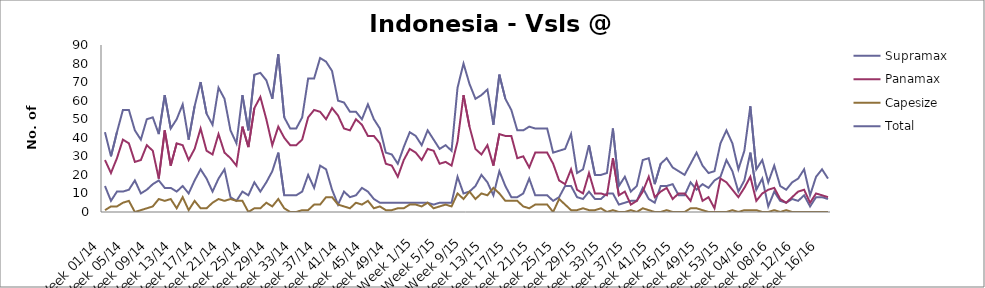
| Category | Supramax | Panamax | Capesize | Total |
|---|---|---|---|---|
| Week 01/14 | 14 | 28 | 1 | 43 |
| Week 02/14 | 6 | 21 | 3 | 30 |
| Week 03/14 | 11 | 29 | 3 | 43 |
| Week 04/14 | 11 | 39 | 5 | 55 |
| Week 05/14 | 12 | 37 | 6 | 55 |
| Week 06/14 | 17 | 27 | 0 | 44 |
| Week 07/14 | 10 | 28 | 1 | 39 |
| Week 08/14 | 12 | 36 | 2 | 50 |
| Week 09/14 | 15 | 33 | 3 | 51 |
| Week 10/14 | 17 | 18 | 7 | 42 |
| Week 11/14 | 13 | 44 | 6 | 63 |
| Week 12/14 | 13 | 25 | 7 | 45 |
| Week 13/14 | 11 | 37 | 2 | 50 |
| Week 14/14 | 14 | 36 | 8 | 58 |
| Week 15/14 | 10 | 28 | 1 | 39 |
| Week 16/14 | 17 | 34 | 6 | 57 |
| Week 17/14 | 23 | 45 | 2 | 70 |
| Week 18/14 | 18 | 33 | 2 | 53 |
| Week 19/14 | 11 | 31 | 5 | 47 |
| Week 20/14 | 18 | 42 | 7 | 67 |
| Week 21/14 | 23 | 32 | 6 | 61 |
| Week 22/14 | 8 | 29 | 7 | 44 |
| Week 23/14 | 6 | 25 | 6 | 37 |
| Week 24/14 | 11 | 46 | 6 | 63 |
| Week 25/14 | 9 | 35 | 0 | 44 |
| Week 26/14 | 16 | 56 | 2 | 74 |
| Week 27/14 | 11 | 62 | 2 | 75 |
| Week 28/14 | 16 | 50 | 5 | 71 |
| Week 29/14 | 22 | 36 | 3 | 61 |
| Week 30/14 | 32 | 46 | 7 | 85 |
| Week 31/14 | 9 | 40 | 2 | 51 |
| Week 32/14 | 9 | 36 | 0 | 45 |
| Week 33/14 | 9 | 36 | 0 | 45 |
| Week 34/14 | 11 | 39 | 1 | 51 |
| Week 35/14 | 20 | 51 | 1 | 72 |
| Week 36/14 | 13 | 55 | 4 | 72 |
| Week 37/14 | 25 | 54 | 4 | 83 |
| Week 38/14 | 23 | 50 | 8 | 81 |
| Week 39/14 | 12 | 56 | 8 | 76 |
| Week 40/14 | 4 | 52 | 4 | 60 |
| Week 41/14 | 11 | 45 | 3 | 59 |
| Week 42/14 | 8 | 44 | 2 | 54 |
| Week 43/14 | 9 | 50 | 5 | 54 |
| Week 44/14 | 13 | 47 | 4 | 50 |
| Week 45/14 | 11 | 41 | 6 | 58 |
| Week 46/14 | 7 | 41 | 2 | 50 |
| Week 47/14 | 5 | 37 | 3 | 45 |
| Week 48/14 | 5 | 26 | 1 | 32 |
| Week 49/14 | 5 | 25 | 1 | 31 |
| Week 50/14 | 5 | 19 | 2 | 26 |
| Week 51/14 | 5 | 28 | 2 | 35 |
| Week 52/14 | 5 | 34 | 4 | 43 |
| Week 1/15 | 5 | 32 | 4 | 41 |
| Week 2/15 | 5 | 28 | 3 | 36 |
| Week 3/15 | 5 | 34 | 5 | 44 |
| Week 4/15 | 4 | 33 | 2 | 39 |
| Week 5/15 | 5 | 26 | 3 | 34 |
| Week 6/15 | 5 | 27 | 4 | 36 |
| Week 7/15 | 5 | 25 | 3 | 33 |
| Week 8/15 | 19 | 38 | 10 | 67 |
| Week 9/15 | 10 | 63 | 7 | 80 |
| Week 10/15 | 11 | 46 | 11 | 69 |
| Week 11/15 | 14 | 34 | 7 | 61 |
| Week 12/15 | 20 | 31 | 10 | 63 |
| Week 13/15 | 16 | 36 | 9 | 66 |
| Week 14/15 | 9 | 25 | 13 | 47 |
| Week 15/15 | 22 | 42 | 10 | 74 |
| Week 16/15 | 14 | 41 | 6 | 61 |
| Week 17/15 | 8 | 41 | 6 | 55 |
| Week 18/15 | 8 | 29 | 6 | 44 |
| Week 19/15 | 10 | 30 | 3 | 44 |
| Week 20/15 | 18 | 24 | 2 | 46 |
| Week 21/15 | 9 | 32 | 4 | 45 |
| Week 22/15 | 9 | 32 | 4 | 45 |
| Week 23/15 | 9 | 32 | 4 | 45 |
| Week 24/15 | 6 | 26 | 0 | 32 |
| Week 25/15 | 8 | 17 | 7 | 33 |
| Week 26/15 | 14 | 15 | 4 | 34 |
| Week 27/15 | 14 | 23 | 1 | 42 |
| Week 28/15 | 8 | 12 | 1 | 21 |
| Week 29/15 | 7 | 10 | 2 | 23 |
| Week 30/15 | 11 | 21 | 1 | 36 |
| Week 31/15 | 7 | 10 | 1 | 20 |
| Week 32/15 | 7 | 10 | 2 | 20 |
| Week 33/15 | 10 | 9 | 0 | 21 |
| Week 34/15 | 10 | 29 | 1 | 45 |
| Week 35/15 | 4 | 9 | 0 | 14 |
| Week 36/15 | 5 | 11 | 0 | 19 |
| Week 37/15 | 6 | 4 | 1 | 11 |
| Week 38/15 | 6 | 6 | 0 | 14 |
| Week 39/15 | 13 | 11 | 2 | 28 |
| Week 40/15 | 7 | 19 | 1 | 29 |
| Week 41/15 | 5 | 8 | 0 | 15 |
| Week 42/15 | 14 | 11 | 0 | 26 |
| Week 43/15 | 14 | 13 | 1 | 29 |
| Week 44/15 | 15 | 7 | 0 | 24 |
| Week 45/15 | 9 | 10 | 0 | 22 |
| Week 46/15 | 9 | 10 | 0 | 20 |
| Week 47/15 | 16 | 6 | 2 | 26 |
| Week 48/15 | 12 | 16 | 2 | 32 |
| Week 49/15 | 15 | 6 | 1 | 25 |
| Week 50/15 | 13 | 8 | 0 | 21 |
| Week 51/15 | 17 | 2 | 0 | 22 |
| Week 52/15 | 19 | 18 | 0 | 37 |
| Week 53/15 | 28 | 16 | 0 | 44 |
| Week 01/16 | 22 | 12 | 1 | 37 |
| Week 02/16 | 11 | 8 | 0 | 23 |
| Week 03/16 | 17 | 13 | 1 | 33 |
| Week 04/16 | 32 | 19 | 1 | 57 |
| Week 05/16 | 12 | 6 | 1 | 23 |
| Week 06/16 | 18 | 10 | 0 | 28 |
| Week 07/16 | 3 | 12 | 0 | 16 |
| Week 08/16 | 11 | 13 | 1 | 25 |
| Week 09/16 | 6 | 7 | 0 | 14 |
| Week 10/16 | 5 | 5 | 1 | 12 |
| Week 11/16 | 7 | 8 | 0 | 16 |
| Week 12/16 | 6 | 11 | 0 | 18 |
| Week 13/16 | 9 | 12 | 0 | 23 |
| Week 14/16 | 3 | 5 | 0 | 9 |
| Week 15/16 | 8 | 10 | 0 | 19 |
| Week 16/16 | 8 | 9 | 0 | 23 |
| Week 17/16 | 7 | 8 | 0 | 18 |